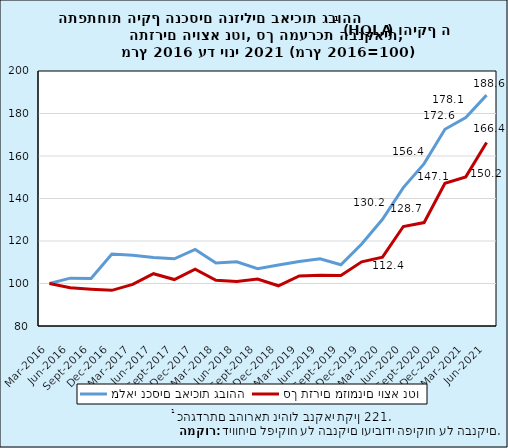
| Category | מלאי נכסים באיכות גבוהה | סך תזרים מזומנים יוצא נטו |
|---|---|---|
| 2016-03-31 | 100 | 100 |
| 2016-06-30 | 102.517 | 97.969 |
| 2016-09-30 | 102.365 | 97.29 |
| 2016-12-31 | 113.916 | 96.777 |
| 2017-03-31 | 113.263 | 99.591 |
| 2017-06-30 | 112.249 | 104.604 |
| 2017-09-30 | 111.605 | 101.861 |
| 2017-12-31 | 116.029 | 106.751 |
| 2018-03-31 | 109.671 | 101.529 |
| 2018-06-30 | 110.204 | 100.888 |
| 2018-09-30 | 106.987 | 102.101 |
| 2018-12-31 | 108.748 | 98.921 |
| 2019-03-31 | 110.344 | 103.556 |
| 2019-06-30 | 111.652 | 103.889 |
| 2019-09-30 | 108.851 | 103.77 |
| 2019-12-31 | 118.602 | 110.218 |
| 2020-03-31 | 130.195 | 112.403 |
| 2020-06-30 | 145.122 | 126.814 |
| 2020-09-30 | 156.409 | 128.681 |
| 2020-12-31 | 172.587 | 147.138 |
| 2021-03-31 | 178.138 | 150.182 |
| 2021-06-30 | 188.639 | 166.386 |